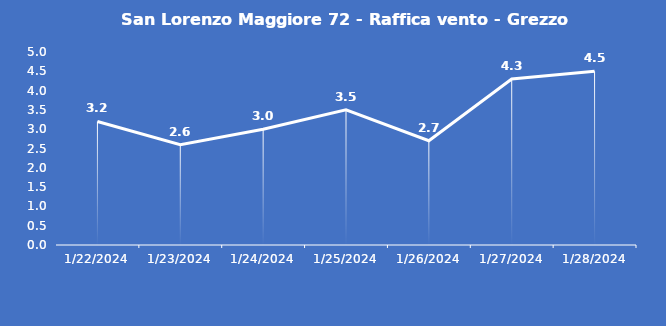
| Category | San Lorenzo Maggiore 72 - Raffica vento - Grezzo (m/s) |
|---|---|
| 1/22/24 | 3.2 |
| 1/23/24 | 2.6 |
| 1/24/24 | 3 |
| 1/25/24 | 3.5 |
| 1/26/24 | 2.7 |
| 1/27/24 | 4.3 |
| 1/28/24 | 4.5 |